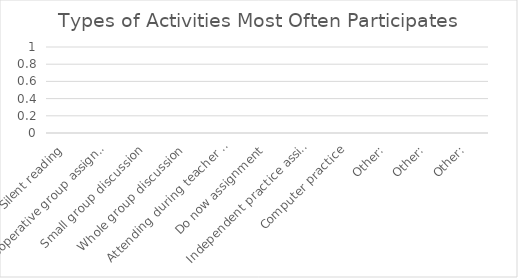
| Category | Series 0 |
|---|---|
| Silent reading | 0 |
| Cooperative group assignment | 0 |
| Small group discussion | 0 |
| Whole group discussion | 0 |
| Attending during teacher directed instruction | 0 |
| Do now assignment | 0 |
| Independent practice assignment | 0 |
| Computer practice | 0 |
| Other: | 0 |
| Other: | 0 |
| Other: | 0 |